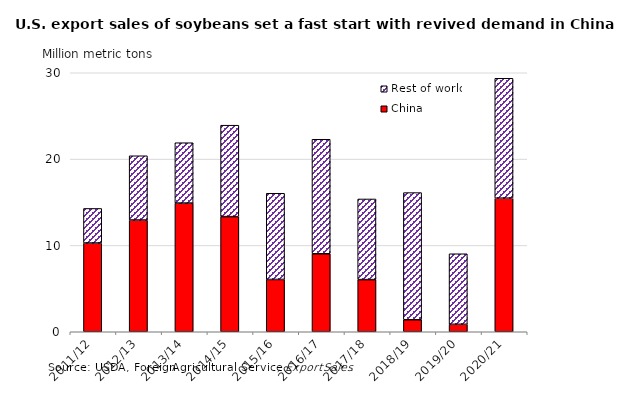
| Category | China | Rest of world |
|---|---|---|
| 2011/12 | 10.277 | 4.007 |
| 2012/13 | 12.943 | 7.442 |
| 2013/14 | 14.905 | 6.992 |
| 2014/15 | 13.335 | 10.591 |
| 2015/16 | 6.057 | 9.986 |
| 2016/17 | 9.032 | 13.266 |
| 2017/18 | 6.04 | 9.341 |
| 2018/19 | 1.391 | 14.728 |
| 2019/20 | 0.864 | 8.169 |
| 2020/21 | 15.474 | 13.886 |